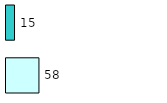
| Category | Series 0 | Series 1 |
|---|---|---|
| 0 | 58 | 15 |